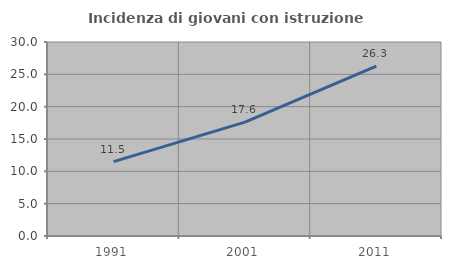
| Category | Incidenza di giovani con istruzione universitaria |
|---|---|
| 1991.0 | 11.504 |
| 2001.0 | 17.609 |
| 2011.0 | 26.259 |